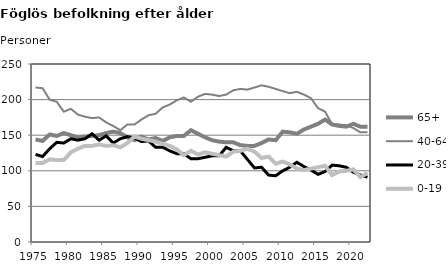
| Category | 65+ | 40-64 | 20-39 | 0-19 |
|---|---|---|---|---|
| 1975.0 | 144 | 217 | 123 | 111 |
| 1976.0 | 142 | 216 | 120 | 111 |
| 1977.0 | 151 | 200 | 131 | 116 |
| 1978.0 | 149 | 197 | 140 | 115 |
| 1979.0 | 153 | 183 | 139 | 115 |
| 1980.0 | 150 | 187 | 145 | 126 |
| 1981.0 | 147 | 179 | 143 | 131 |
| 1982.0 | 148 | 176 | 145 | 135 |
| 1983.0 | 149 | 174 | 152 | 135 |
| 1984.0 | 150 | 175 | 143 | 137 |
| 1985.0 | 153 | 168 | 149 | 135 |
| 1986.0 | 155 | 163 | 139 | 136 |
| 1987.0 | 153 | 157 | 145 | 133 |
| 1988.0 | 147 | 165 | 148 | 139 |
| 1989.0 | 143 | 165 | 146 | 148 |
| 1990.0 | 148 | 172 | 141 | 145 |
| 1991.0 | 144 | 178 | 142 | 143 |
| 1992.0 | 146 | 180 | 133 | 141 |
| 1993.0 | 142 | 189 | 133 | 138 |
| 1994.0 | 147 | 193 | 128 | 135 |
| 1995.0 | 149 | 199 | 124 | 130 |
| 1996.0 | 149 | 203 | 124 | 122 |
| 1997.0 | 157 | 197 | 117 | 128 |
| 1998.0 | 152 | 204 | 117 | 123 |
| 1999.0 | 147 | 208 | 119 | 126 |
| 2000.0 | 143 | 207 | 121 | 124 |
| 2001.0 | 141 | 205 | 121 | 122 |
| 2002.0 | 140 | 207 | 133 | 120 |
| 2003.0 | 140 | 213 | 128 | 127 |
| 2004.0 | 136 | 215 | 128 | 128 |
| 2005.0 | 135 | 214 | 116 | 131 |
| 2006.0 | 135 | 217 | 104 | 127 |
| 2007.0 | 139 | 220 | 105 | 118 |
| 2008.0 | 144 | 218 | 94 | 120 |
| 2009.0 | 143 | 215 | 93 | 110 |
| 2010.0 | 155 | 212 | 100 | 113 |
| 2011.0 | 154 | 209 | 105 | 109 |
| 2012.0 | 152 | 211 | 112 | 103 |
| 2013.0 | 158 | 207 | 106 | 101 |
| 2014.0 | 162 | 202 | 101 | 103 |
| 2015.0 | 166 | 188 | 95 | 105 |
| 2016.0 | 172 | 183 | 99 | 107 |
| 2017.0 | 165 | 165 | 108 | 94 |
| 2018.0 | 163 | 165 | 107 | 99 |
| 2019.0 | 162 | 164 | 105 | 100 |
| 2020.0 | 166 | 160 | 98 | 102 |
| 2021.0 | 162 | 154 | 94 | 91 |
| 2022.0 | 162 | 154 | 91 | 97 |